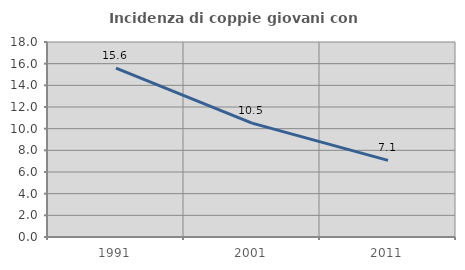
| Category | Incidenza di coppie giovani con figli |
|---|---|
| 1991.0 | 15.581 |
| 2001.0 | 10.509 |
| 2011.0 | 7.07 |